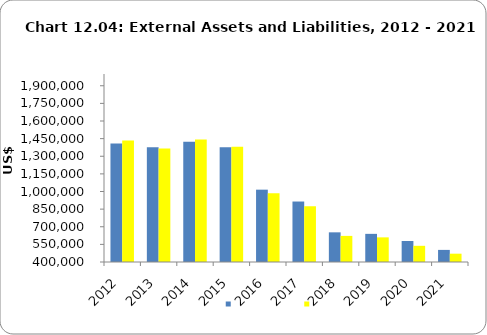
| Category | Series 0 | Series 1 |
|---|---|---|
| 2012.0 | 1409321 | 1434218 |
| 2013.0 | 1377200 | 1366800 |
| 2014.0 | 1423029 | 1443356 |
| 2015.0 | 1377000 | 1380000 |
| 2016.0 | 1015623 | 985470 |
| 2017.0 | 914692 | 874427 |
| 2018.0 | 652463 | 622186 |
| 2019.0 | 639524 | 609685 |
| 2020.0 | 578970 | 537752 |
| 2021.0 | 502979 | 470799 |